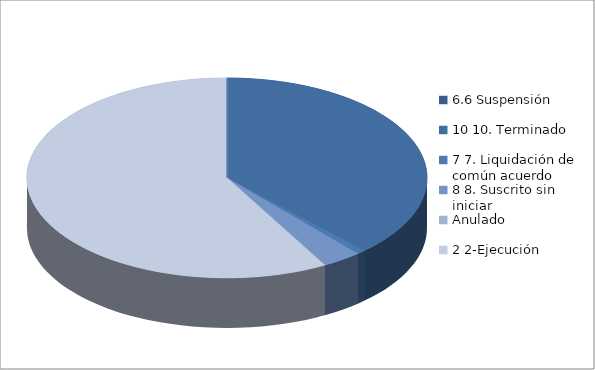
| Category | Series 0 |
|---|---|
| 6.6 Suspensión | 0 |
| 10 10. Terminado | 283 |
| 7 7. Liquidación de común acuerdo | 5 |
| 8 8. Suscrito sin iniciar | 24 |
| Anulado | 0 |
| 2 2-Ejecución | 433 |